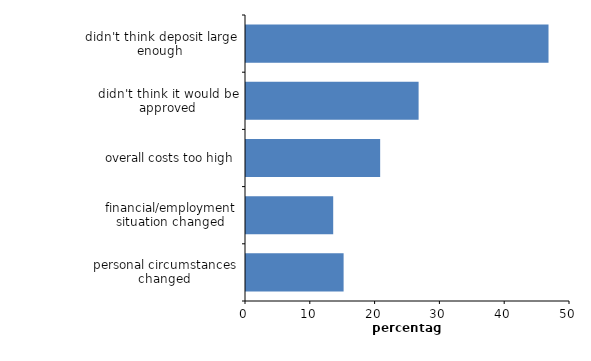
| Category | Series 0 |
|---|---|
| didn't think deposit large enough | 46.684 |
| didn't think it would be approved | 26.636 |
| overall costs too high | 20.704 |
| financial/employment situation changed | 13.457 |
| personal circumstances changed | 15.062 |